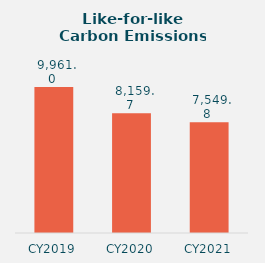
| Category | Series 0 |
|---|---|
| CY2019 | 9960.95 |
| CY2020 | 8159.7 |
| CY2021 | 7549.81 |